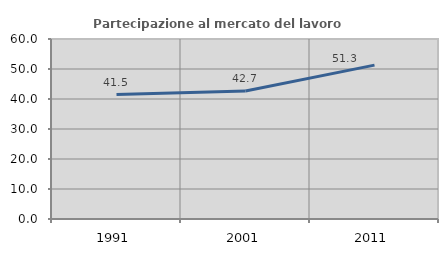
| Category | Partecipazione al mercato del lavoro  femminile |
|---|---|
| 1991.0 | 41.486 |
| 2001.0 | 42.689 |
| 2011.0 | 51.282 |